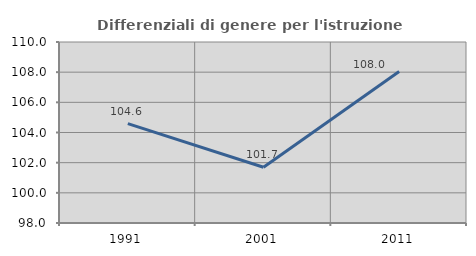
| Category | Differenziali di genere per l'istruzione superiore |
|---|---|
| 1991.0 | 104.588 |
| 2001.0 | 101.699 |
| 2011.0 | 108.042 |